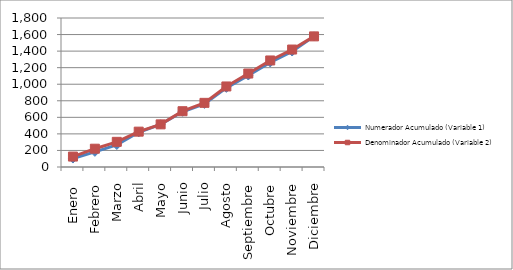
| Category | Numerador Acumulado (Variable 1) | Denominador Acumulado (Variable 2) |
|---|---|---|
| Enero  | 102 | 126 |
| Febrero | 183 | 221 |
| Marzo | 266 | 304 |
| Abril | 419 | 427 |
| Mayo | 516 | 515 |
| Junio | 667 | 674 |
| Julio | 762 | 775 |
| Agosto | 956 | 973 |
| Septiembre | 1105 | 1129 |
| Octubre | 1263 | 1287 |
| Noviembre | 1395 | 1419 |
| Diciembre | 1578 | 1578 |